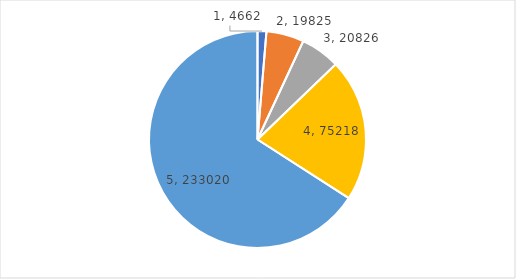
| Category | Series 0 |
|---|---|
| 0 | 4662 |
| 1 | 19825 |
| 2 | 20826 |
| 3 | 75218 |
| 4 | 233020 |